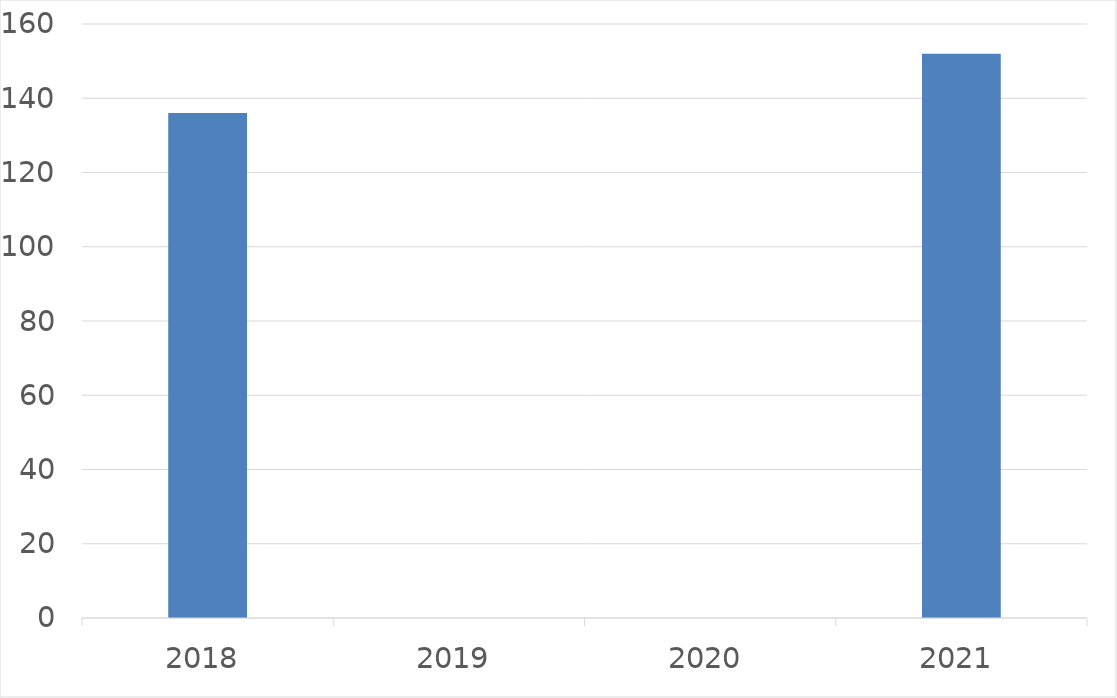
| Category | Series 0 |
|---|---|
| 2018 | 136 |
| 2019 | 0 |
| 2020 | 0 |
| 2021 | 152 |